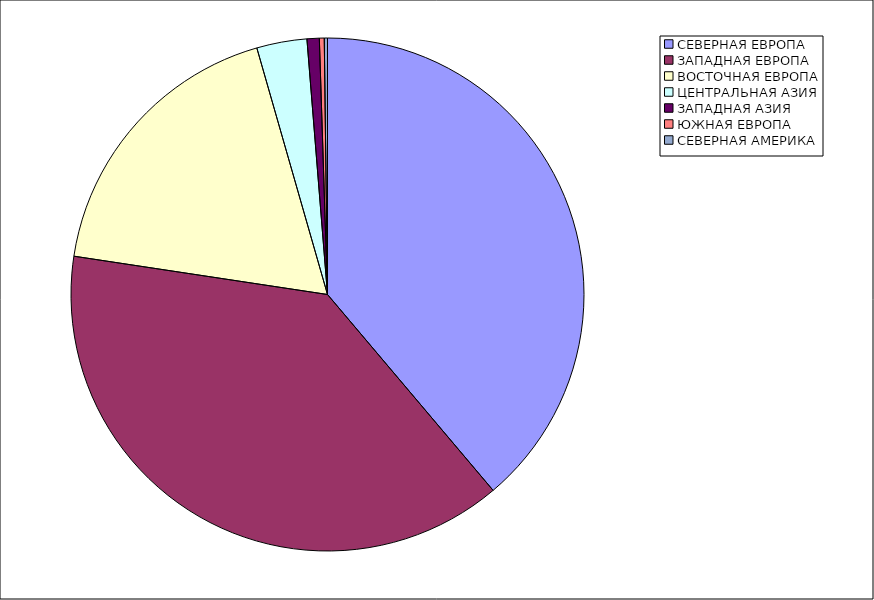
| Category | Оборот |
|---|---|
| СЕВЕРНАЯ ЕВРОПА | 38.829 |
| ЗАПАДНАЯ ЕВРОПА | 38.558 |
| ВОСТОЧНАЯ ЕВРОПА | 18.17 |
| ЦЕНТРАЛЬНАЯ АЗИЯ | 3.163 |
| ЗАПАДНАЯ АЗИЯ | 0.772 |
| ЮЖНАЯ ЕВРОПА | 0.306 |
| СЕВЕРНАЯ АМЕРИКА | 0.201 |